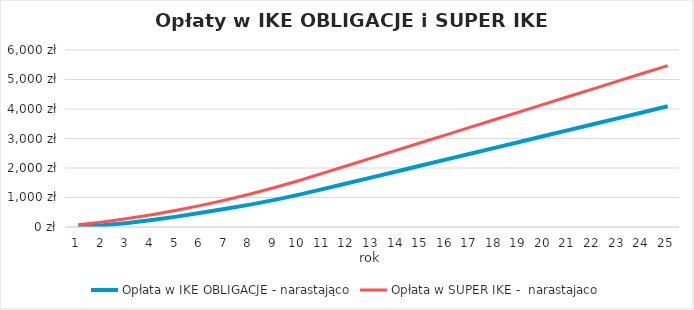
| Category | Opłata w IKE OBLIGACJE - narastająco | Opłata w SUPER IKE -  narastajaco |
|---|---|---|
| 0 | 0 | 77.766 |
| 1 | 56.851 | 173.298 |
| 2 | 136.798 | 286.596 |
| 3 | 236.288 | 417.66 |
| 4 | 351.767 | 566.49 |
| 5 | 479.682 | 733.086 |
| 6 | 616.48 | 917.448 |
| 7 | 758.608 | 1119.576 |
| 8 | 918.502 | 1339.47 |
| 9 | 1096.162 | 1577.13 |
| 10 | 1291.588 | 1832.556 |
| 11 | 1491.588 | 2092.556 |
| 12 | 1691.588 | 2352.556 |
| 13 | 1891.588 | 2612.556 |
| 14 | 2091.588 | 2872.556 |
| 15 | 2291.588 | 3132.556 |
| 16 | 2491.588 | 3392.556 |
| 17 | 2691.588 | 3652.556 |
| 18 | 2891.588 | 3912.556 |
| 19 | 3091.588 | 4172.556 |
| 20 | 3291.588 | 4432.556 |
| 21 | 3491.588 | 4692.556 |
| 22 | 3691.588 | 4952.556 |
| 23 | 3891.588 | 5212.556 |
| 24 | 4091.588 | 5472.556 |